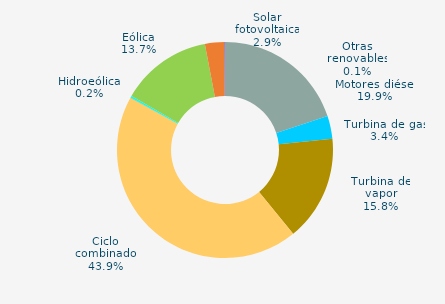
| Category | Series 0 |
|---|---|
| Motores diésel | 19.899 |
| Turbina de gas | 3.433 |
| Turbina de vapor | 15.798 |
| Ciclo combinado | 43.92 |
| Cogeneración | 0 |
| Hidráulica | 0.039 |
| Hidroeólica | 0.228 |
| Eólica | 13.695 |
| Solar fotovoltaica | 2.877 |
| Otras renovables | 0.111 |